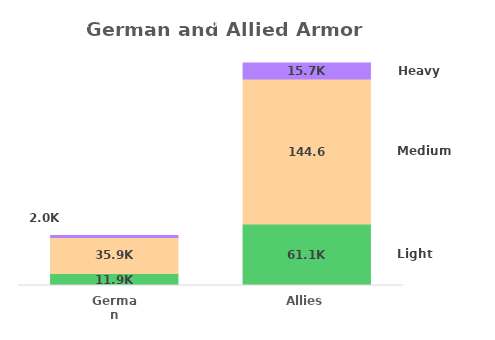
| Category | Light | Medium | Heavy |
|---|---|---|---|
| German | 11924 | 35925 | 2027 |
| Allies | 61142 | 144640 | 15719 |